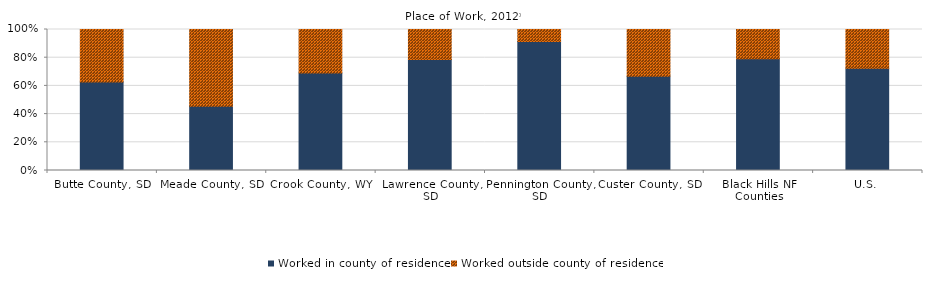
| Category | Worked in county of residence | Worked outside county of residence |
|---|---|---|
| Gallatin County, MT | 0.949 | 0.051 |
| County Region | 0.949 | 0.051 |
| U.S. | 0.725 | 0.275 |